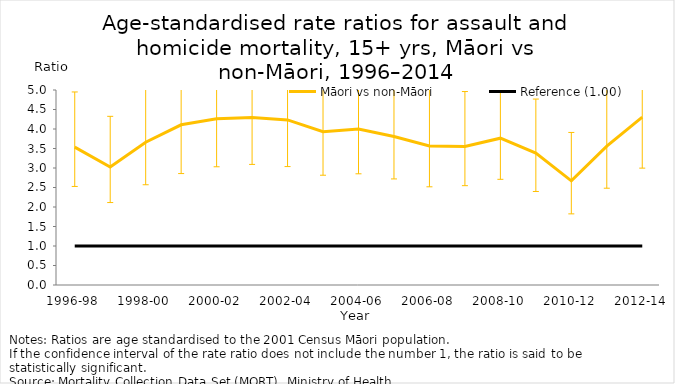
| Category | Māori vs non-Māori | Reference (1.00) |
|---|---|---|
| 1996-98 | 3.536 | 1 |
| 1997-99 | 3.024 | 1 |
| 1998-00 | 3.661 | 1 |
| 1999-01 | 4.108 | 1 |
| 2000-02 | 4.265 | 1 |
| 2001-03 | 4.296 | 1 |
| 2002-04 | 4.233 | 1 |
| 2003-05 | 3.931 | 1 |
| 2004-06 | 3.999 | 1 |
| 2005-07 | 3.807 | 1 |
| 2006-08 | 3.566 | 1 |
| 2007-09 | 3.554 | 1 |
| 2008-10 | 3.765 | 1 |
| 2009-11 | 3.381 | 1 |
| 2010-12 | 2.671 | 1 |
| 2011-13 | 3.559 | 1 |
| 2012-14 | 4.303 | 1 |